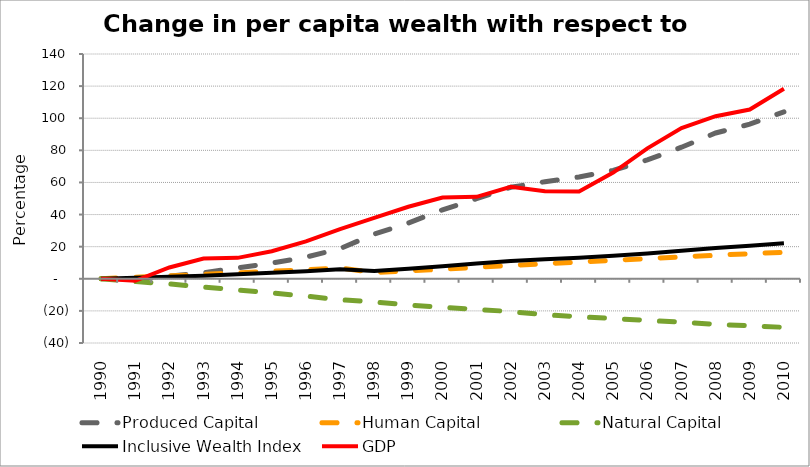
| Category | Produced Capital  | Human Capital | Natural Capital | Inclusive Wealth Index | GDP |
|---|---|---|---|---|---|
| 1990.0 | 0 | 0 | 0 | 0 | 0 |
| 1991.0 | 0.257 | 0.966 | -1.722 | 0.567 | -1.226 |
| 1992.0 | 1.631 | 1.829 | -3.201 | 1.224 | 7.032 |
| 1993.0 | 3.778 | 2.717 | -5.136 | 1.943 | 12.575 |
| 1994.0 | 6.776 | 3.69 | -7.014 | 2.84 | 13.037 |
| 1995.0 | 9.745 | 4.696 | -8.785 | 3.77 | 17.118 |
| 1996.0 | 13.474 | 5.64 | -10.793 | 4.721 | 23.313 |
| 1997.0 | 18.757 | 6.653 | -13.048 | 5.89 | 30.974 |
| 1998.0 | 27.793 | 3.923 | -14.376 | 4.79 | 37.899 |
| 1999.0 | 34.732 | 4.956 | -16.348 | 6.213 | 44.837 |
| 2000.0 | 42.951 | 5.955 | -17.77 | 7.834 | 50.647 |
| 2001.0 | 49.884 | 7.191 | -19.108 | 9.484 | 51.012 |
| 2002.0 | 56.976 | 8.319 | -20.415 | 11.074 | 57.328 |
| 2003.0 | 60.447 | 9.404 | -22.428 | 12.1 | 54.581 |
| 2004.0 | 63.372 | 10.482 | -23.632 | 13.146 | 54.301 |
| 2005.0 | 67.533 | 11.55 | -24.797 | 14.342 | 66.149 |
| 2006.0 | 74.05 | 12.581 | -25.929 | 15.807 | 81.257 |
| 2007.0 | 81.949 | 13.647 | -27.025 | 17.476 | 93.861 |
| 2008.0 | 90.797 | 14.641 | -28.348 | 19.183 | 101.241 |
| 2009.0 | 96.266 | 15.624 | -29.312 | 20.501 | 105.389 |
| 2010.0 | 104.006 | 16.545 | -30.241 | 22.06 | 118.401 |